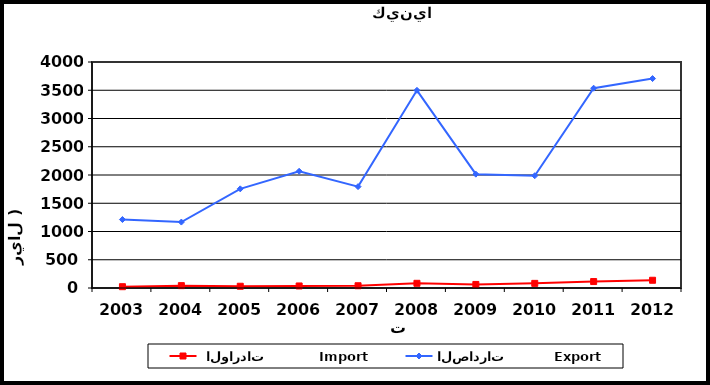
| Category |  الواردات           Import | الصادرات          Export |
|---|---|---|
| 2003.0 | 23 | 1212 |
| 2004.0 | 42 | 1167 |
| 2005.0 | 31 | 1755 |
| 2006.0 | 36 | 2066 |
| 2007.0 | 40 | 1794 |
| 2008.0 | 83 | 3499 |
| 2009.0 | 63 | 2015 |
| 2010.0 | 82 | 1987 |
| 2011.0 | 114 | 3536 |
| 2012.0 | 137 | 3707 |